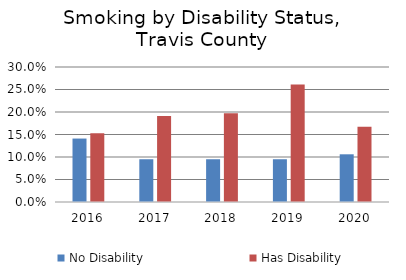
| Category | No Disability | Has Disability |
|---|---|---|
| 2016.0 | 0.141 | 0.153 |
| 2017.0 | 0.095 | 0.191 |
| 2018.0 | 0.095 | 0.197 |
| 2019.0 | 0.095 | 0.261 |
| 2020.0 | 0.106 | 0.167 |